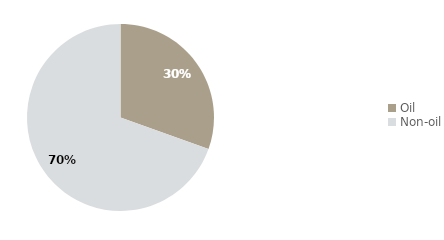
| Category | Q4 2016 |
|---|---|
| Oil | 30.491 |
| Non-oil | 69.509 |